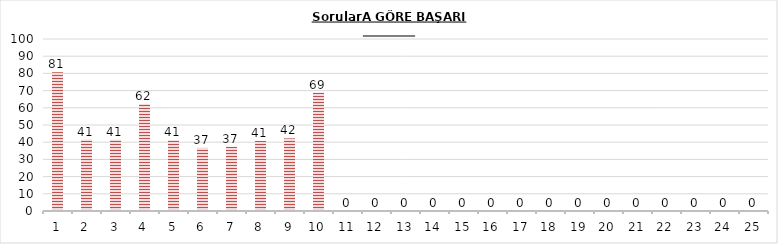
| Category | Series 0 |
|---|---|
| 0 | 80.741 |
| 1 | 41.481 |
| 2 | 41.481 |
| 3 | 62.222 |
| 4 | 41.111 |
| 5 | 36.667 |
| 6 | 37.407 |
| 7 | 40.741 |
| 8 | 42.222 |
| 9 | 68.889 |
| 10 | 0 |
| 11 | 0 |
| 12 | 0 |
| 13 | 0 |
| 14 | 0 |
| 15 | 0 |
| 16 | 0 |
| 17 | 0 |
| 18 | 0 |
| 19 | 0 |
| 20 | 0 |
| 21 | 0 |
| 22 | 0 |
| 23 | 0 |
| 24 | 0 |